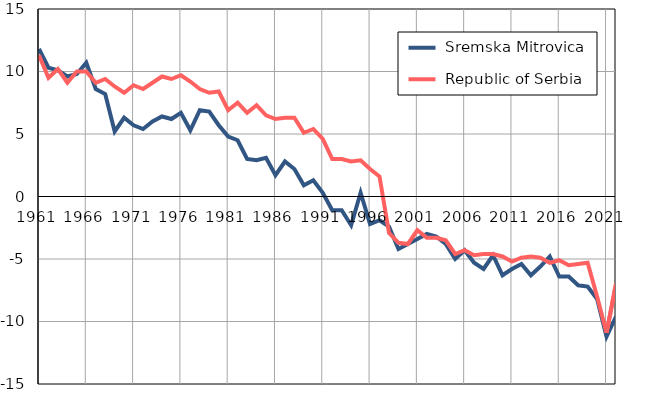
| Category |  Sremska Mitrovica |  Republic of Serbia |
|---|---|---|
| 1961.0 | 11.8 | 11.3 |
| 1962.0 | 10.3 | 9.5 |
| 1963.0 | 10.1 | 10.2 |
| 1964.0 | 9.6 | 9.1 |
| 1965.0 | 9.8 | 10 |
| 1966.0 | 10.7 | 10 |
| 1967.0 | 8.6 | 9.1 |
| 1968.0 | 8.2 | 9.4 |
| 1969.0 | 5.2 | 8.8 |
| 1970.0 | 6.3 | 8.3 |
| 1971.0 | 5.7 | 8.9 |
| 1972.0 | 5.4 | 8.6 |
| 1973.0 | 6 | 9.1 |
| 1974.0 | 6.4 | 9.6 |
| 1975.0 | 6.2 | 9.4 |
| 1976.0 | 6.7 | 9.7 |
| 1977.0 | 5.3 | 9.2 |
| 1978.0 | 6.9 | 8.6 |
| 1979.0 | 6.8 | 8.3 |
| 1980.0 | 5.7 | 8.4 |
| 1981.0 | 4.8 | 6.9 |
| 1982.0 | 4.5 | 7.5 |
| 1983.0 | 3 | 6.7 |
| 1984.0 | 2.9 | 7.3 |
| 1985.0 | 3.1 | 6.5 |
| 1986.0 | 1.7 | 6.2 |
| 1987.0 | 2.8 | 6.3 |
| 1988.0 | 2.2 | 6.3 |
| 1989.0 | 0.9 | 5.1 |
| 1990.0 | 1.3 | 5.4 |
| 1991.0 | 0.3 | 4.6 |
| 1992.0 | -1.1 | 3 |
| 1993.0 | -1.1 | 3 |
| 1994.0 | -2.3 | 2.8 |
| 1995.0 | 0.3 | 2.9 |
| 1996.0 | -2.2 | 2.2 |
| 1997.0 | -1.9 | 1.6 |
| 1998.0 | -2.4 | -2.9 |
| 1999.0 | -4.2 | -3.7 |
| 2000.0 | -3.8 | -3.8 |
| 2001.0 | -3.4 | -2.7 |
| 2002.0 | -3 | -3.3 |
| 2003.0 | -3.2 | -3.3 |
| 2004.0 | -3.8 | -3.5 |
| 2005.0 | -5 | -4.6 |
| 2006.0 | -4.3 | -4.3 |
| 2007.0 | -5.3 | -4.7 |
| 2008.0 | -5.8 | -4.6 |
| 2009.0 | -4.7 | -4.6 |
| 2010.0 | -6.3 | -4.8 |
| 2011.0 | -5.8 | -5.2 |
| 2012.0 | -5.4 | -4.9 |
| 2013.0 | -6.3 | -4.8 |
| 2014.0 | -5.6 | -4.9 |
| 2015.0 | -4.8 | -5.3 |
| 2016.0 | -6.4 | -5.1 |
| 2017.0 | -6.4 | -5.5 |
| 2018.0 | -7.1 | -5.4 |
| 2019.0 | -7.2 | -5.3 |
| 2020.0 | -8.2 | -8 |
| 2021.0 | -11.2 | -10.9 |
| 2022.0 | -9.6 | -7 |